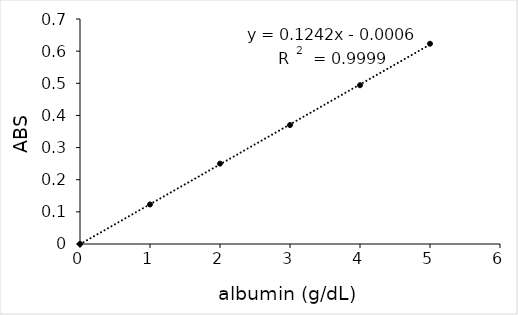
| Category | -blank |
|---|---|
| 0.0 | 0 |
| 1.0 | 0.123 |
| 2.0 | 0.25 |
| 3.0 | 0.37 |
| 4.0 | 0.494 |
| 5.0 | 0.623 |